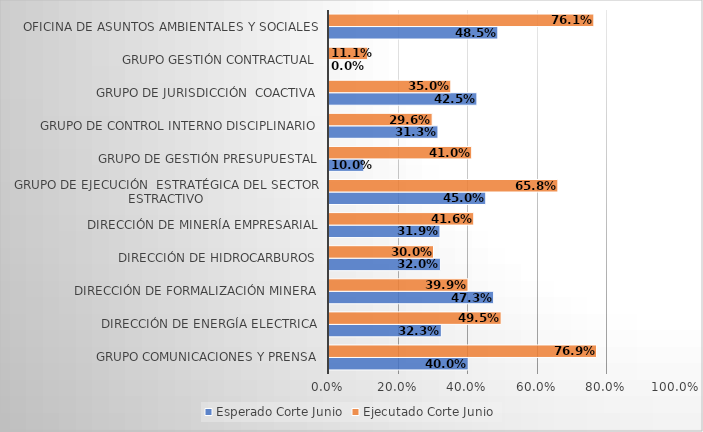
| Category | Esperado Corte Junio | Ejecutado Corte Junio |
|---|---|---|
| Grupo Comunicaciones y Prensa | 0.4 | 0.769 |
| Dirección de energía electrica | 0.323 | 0.495 |
| Dirección de Formalización Minera | 0.473 | 0.399 |
| Dirección de hidrocarburos | 0.32 | 0.3 |
| Dirección de Minería Empresarial | 0.319 | 0.416 |
| Grupo de Ejecución  Estratégica del Sector Estractivo | 0.45 | 0.658 |
| Grupo de Gestión presupuestal | 0.1 | 0.41 |
| Grupo de Control Interno Disciplinario | 0.313 | 0.296 |
| Grupo de Jurisdicción  Coactiva | 0.425 | 0.35 |
| Grupo Gestión Contractual | 0 | 0.111 |
| Oficina de Asuntos Ambientales y Sociales | 0.485 | 0.761 |